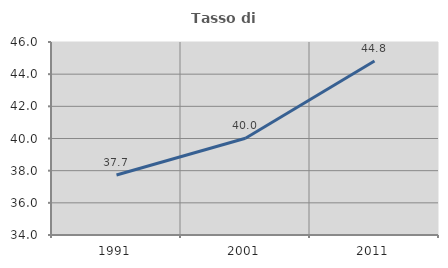
| Category | Tasso di occupazione   |
|---|---|
| 1991.0 | 37.732 |
| 2001.0 | 40.019 |
| 2011.0 | 44.818 |